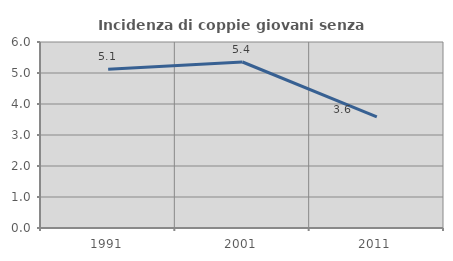
| Category | Incidenza di coppie giovani senza figli |
|---|---|
| 1991.0 | 5.117 |
| 2001.0 | 5.355 |
| 2011.0 | 3.586 |